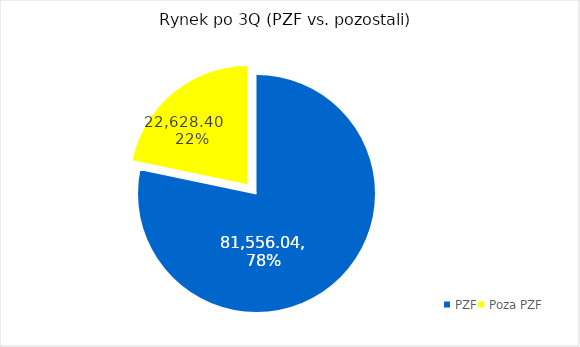
| Category | Series 0 |
|---|---|
| PZF | 81556.04 |
| Poza PZF | 22628.4 |